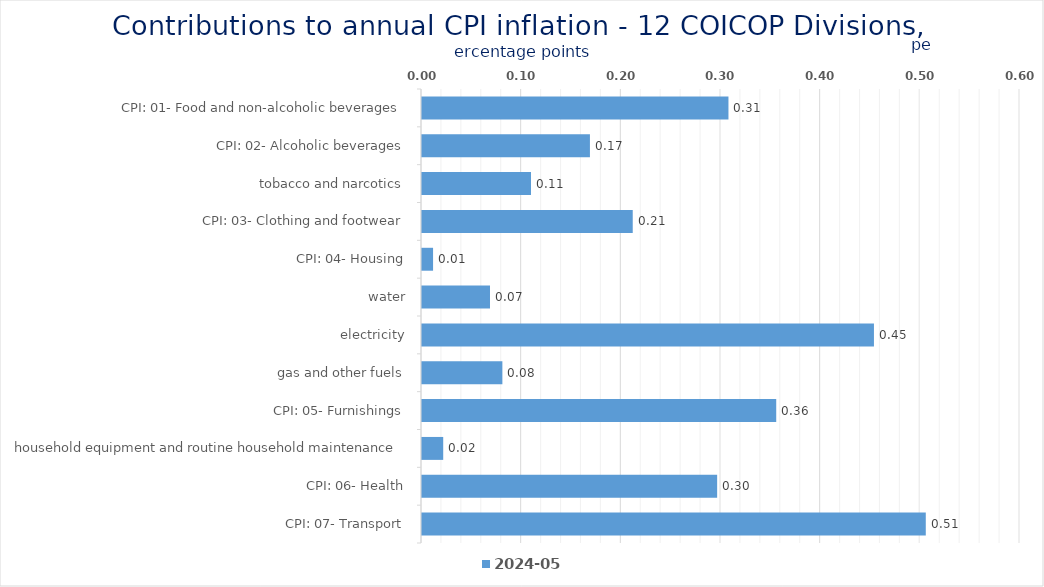
| Category | 2024-05 |
|---|---|
| CPI: 01- Food and non-alcoholic beverages | 0.307 |
| CPI: 02- Alcoholic beverages, tobacco and narcotics | 0.168 |
| CPI: 03- Clothing and footwear | 0.109 |
| CPI: 04- Housing, water, electricity, gas and other fuels | 0.211 |
| CPI: 05- Furnishings, household equipment and routine household maintenance | 0.011 |
| CPI: 06- Health | 0.068 |
| CPI: 07- Transport | 0.453 |
| CPI: 08- Communication | 0.081 |
| CPI: 09- Recreation and culture | 0.355 |
| CPI: 10- Education | 0.021 |
| CPI: 11- Restaurants and hotels | 0.296 |
| CPI: 12- Miscellaneous goods and services | 0.505 |